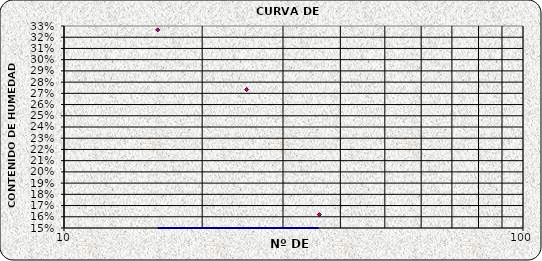
| Category | Series 0 |
|---|---|
| 36.0 | 0.162 |
| 25.0 | 0.273 |
| 16.0 | 0.327 |